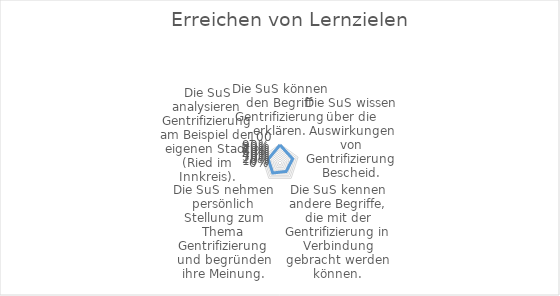
| Category | Series 0 |
|---|---|
| 0 | 0.95 |
| 1 | 0.7 |
| 2 | 0.55 |
| 3 | 0.65 |
| 4 | 0.65 |